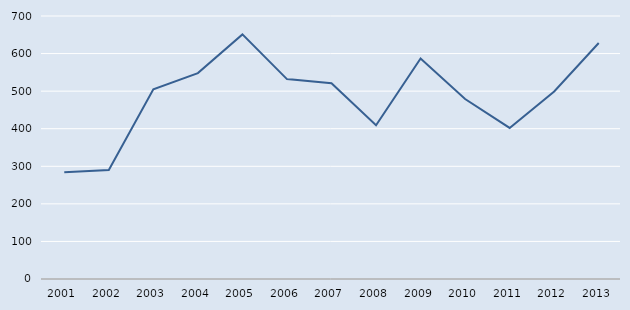
| Category | Series 0 |
|---|---|
| 2001.0 | 284 |
| 2002.0 | 290 |
| 2003.0 | 505 |
| 2004.0 | 548 |
| 2005.0 | 651 |
| 2006.0 | 532 |
| 2007.0 | 521 |
| 2008.0 | 409 |
| 2009.0 | 587 |
| 2010.0 | 479 |
| 2011.0 | 402 |
| 2012.0 | 499 |
| 2013.0 | 628 |